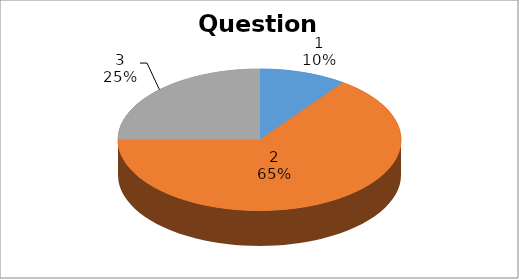
| Category | Series 0 |
|---|---|
| 0 | 2 |
| 1 | 13 |
| 2 | 5 |